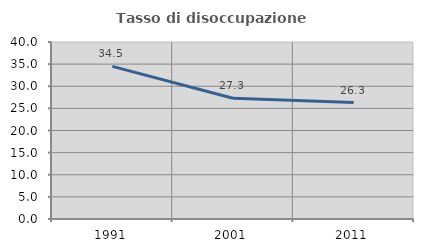
| Category | Tasso di disoccupazione giovanile  |
|---|---|
| 1991.0 | 34.483 |
| 2001.0 | 27.273 |
| 2011.0 | 26.316 |